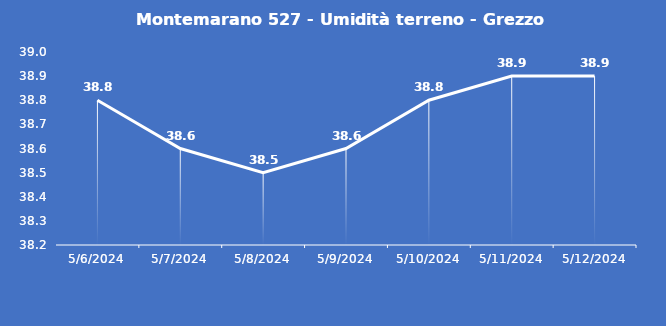
| Category | Montemarano 527 - Umidità terreno - Grezzo (%VWC) |
|---|---|
| 5/6/24 | 38.8 |
| 5/7/24 | 38.6 |
| 5/8/24 | 38.5 |
| 5/9/24 | 38.6 |
| 5/10/24 | 38.8 |
| 5/11/24 | 38.9 |
| 5/12/24 | 38.9 |